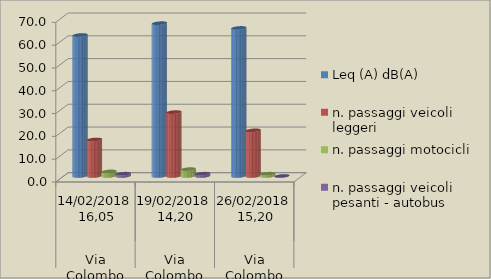
| Category | Leq (A) dB(A) | n. passaggi veicoli leggeri  | n. passaggi motocicli | n. passaggi veicoli pesanti - autobus  |
|---|---|---|---|---|
| 0 | 61.8 | 16 | 2 | 1 |
| 1 | 67 | 28 | 3 | 1 |
| 2 | 64.9 | 20 | 1 | 0 |